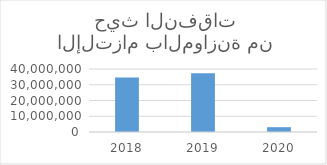
| Category | الإلتزام بالموازنة من حيث النفقات |
|---|---|
| 2018.0 | 34667921 |
| 2019.0 | 37251628 |
| 2020.0 | 3068125 |